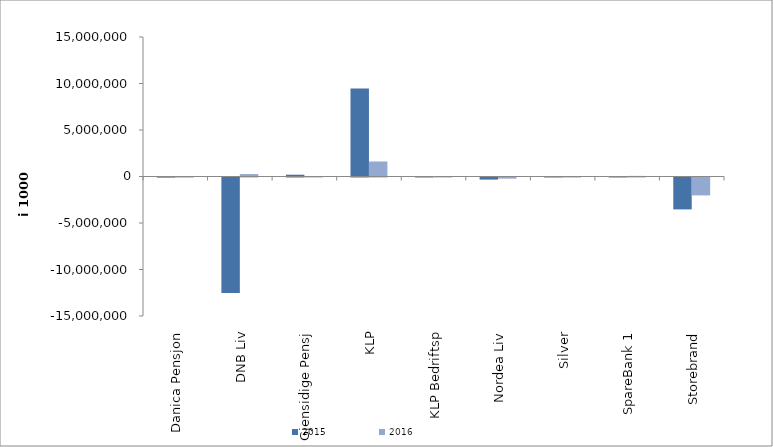
| Category | 2015 | 2016 |
|---|---|---|
| 0 | -16822.71 | -12439.066 |
| 1 | -12415067 | 262638 |
| 2 | 192450.349 | 18936.523 |
| 3 | 9455551.919 | 1614478.551 |
| 4 | 1168 | -820 |
| 5 | -225515.18 | -123516.094 |
| 6 | 6957.17 | -6471.785 |
| 7 | 38496.616 | 64200.531 |
| 8 | -3428844.619 | -1925751.284 |